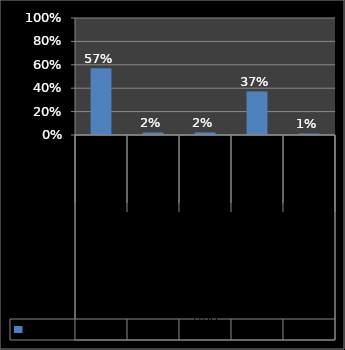
| Category | Series 0 |
|---|---|
| 0 | 0.571 |
| 1 | 0.022 |
| 2 | 0.022 |
| 3 | 0.372 |
| 4 | 0.013 |